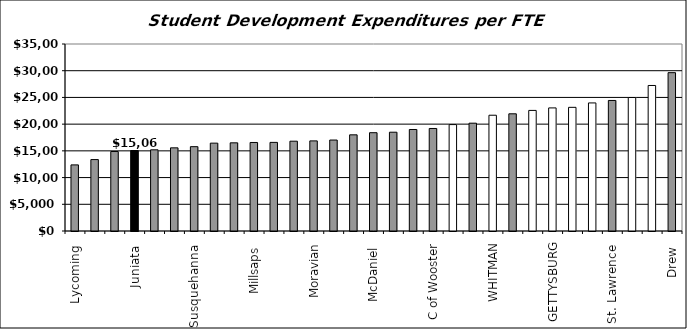
| Category | Stud Exp/FTES |
|---|---|
| Lycoming  | 12372.93 |
| Leb Valley  | 13370.303 |
| Westminster  | 14875.968 |
| Juniata  | 15066 |
| Augustana  | 15198.189 |
| Elizabethtown  | 15565.138 |
| Susquehanna  | 15783.393 |
| Presbyterian  | 16442.814 |
| Wittenberg  | 16501.26 |
| Millsaps  | 16567.501 |
| Washington  | 16586.529 |
| Wash & Jeff | 16808.679 |
| Moravian | 16866.628 |
| Knox  | 17023.739 |
| Allegheny  | 17999.485 |
| McDaniel  | 18398.036 |
| Muhlenberg  | 18490.223 |
| Ursinus  | 18999.768 |
| C of Wooster | 19189.708 |
| CENTRE | 19916.242 |
| Wofford  | 20179.012 |
| WHITMAN | 21668.38 |
| Birm Southern  | 21934.939 |
| DICKINSON | 22570.046 |
| GETTYSBURG | 23038.815 |
| KENYON | 23146.949 |
| UNION | 23971.637 |
| St. Lawrence  | 24432.207 |
| F & M * | 24985.621 |
| SEWANEE | 27237.018 |
| Drew  | 29635.993 |